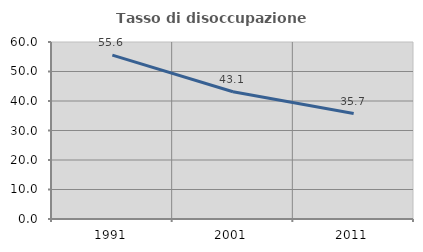
| Category | Tasso di disoccupazione giovanile  |
|---|---|
| 1991.0 | 55.556 |
| 2001.0 | 43.117 |
| 2011.0 | 35.749 |